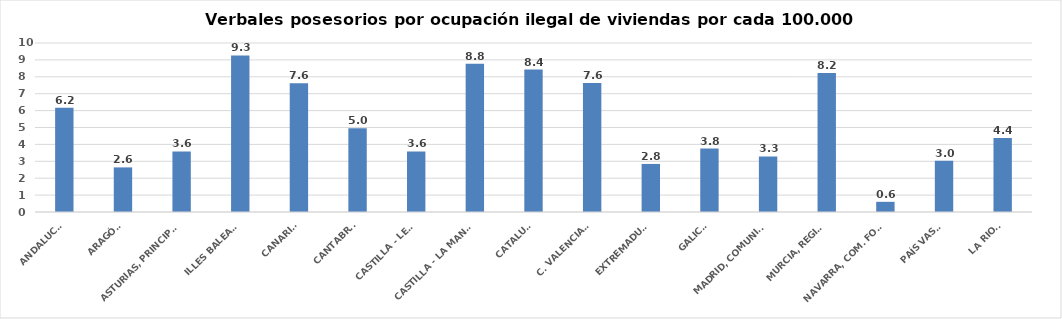
| Category | Series 0 |
|---|---|
| ANDALUCÍA | 6.172 |
| ARAGÓN | 2.639 |
| ASTURIAS, PRINCIPADO | 3.583 |
| ILLES BALEARS | 9.264 |
| CANARIAS | 7.623 |
| CANTABRIA | 4.954 |
| CASTILLA - LEÓN | 3.583 |
| CASTILLA - LA MANCHA | 8.766 |
| CATALUÑA | 8.431 |
| C. VALENCIANA | 7.63 |
| EXTREMADURA | 2.844 |
| GALICIA | 3.754 |
| MADRID, COMUNIDAD | 3.289 |
| MURCIA, REGIÓN | 8.225 |
| NAVARRA, COM. FORAL | 0.602 |
| PAÍS VASCO | 3.034 |
| LA RIOJA | 4.376 |